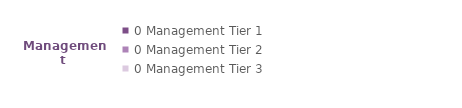
| Category | Series 0 |
|---|---|
| 0 Management Tier 1 | 0 |
| 0 Management Tier 2 | 0 |
| 0 Management Tier 3 | 0 |